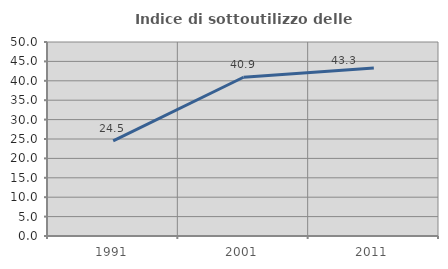
| Category | Indice di sottoutilizzo delle abitazioni  |
|---|---|
| 1991.0 | 24.517 |
| 2001.0 | 40.909 |
| 2011.0 | 43.33 |